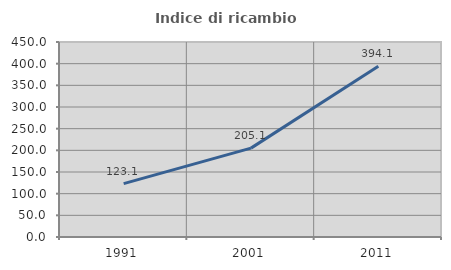
| Category | Indice di ricambio occupazionale  |
|---|---|
| 1991.0 | 123.137 |
| 2001.0 | 205.114 |
| 2011.0 | 394.068 |